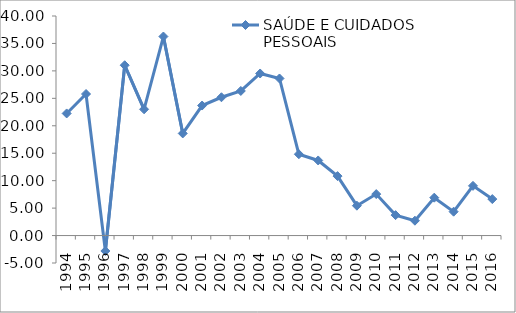
| Category | SAÚDE E CUIDADOS PESSOAIS |
|---|---|
| 1994.0 | 22.245 |
| 1995.0 | 25.788 |
| 1996.0 | -2.812 |
| 1997.0 | 31.028 |
| 1998.0 | 23.007 |
| 1999.0 | 36.261 |
| 2000.0 | 18.604 |
| 2001.0 | 23.687 |
| 2002.0 | 25.196 |
| 2003.0 | 26.342 |
| 2004.0 | 29.526 |
| 2005.0 | 28.615 |
| 2006.0 | 14.82 |
| 2007.0 | 13.681 |
| 2008.0 | 10.833 |
| 2009.0 | 5.444 |
| 2010.0 | 7.557 |
| 2011.0 | 3.725 |
| 2012.0 | 2.708 |
| 2013.0 | 6.899 |
| 2014.0 | 4.35 |
| 2015.0 | 9.054 |
| 2016.0 | 6.643 |